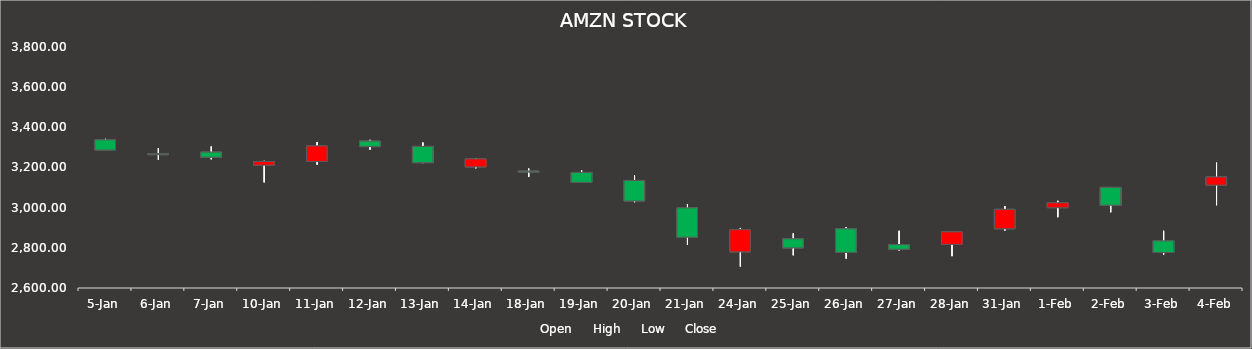
| Category | Open | High | Low | Close |
|---|---|---|---|---|
| 44566.0 | 3337.66 | 3342.53 | 3287.14 | 3287.14 |
| 44567.0 | 3269.01 | 3296 | 3238.74 | 3265.08 |
| 44568.0 | 3276.78 | 3304.87 | 3240.62 | 3251.08 |
| 44571.0 | 3211.71 | 3233.23 | 3126.09 | 3229.72 |
| 44572.0 | 3230 | 3327 | 3214.03 | 3307.24 |
| 44573.0 | 3331.5 | 3337.56 | 3288.34 | 3304.14 |
| 44574.0 | 3305.01 | 3324.43 | 3221.82 | 3224.28 |
| 44575.0 | 3203 | 3245 | 3196.01 | 3242.76 |
| 44579.0 | 3182.1 | 3194.69 | 3153.29 | 3178.35 |
| 44580.0 | 3175.24 | 3185 | 3125 | 3125.98 |
| 44581.0 | 3135.32 | 3160 | 3027.02 | 3033.35 |
| 44582.0 | 2999 | 3018 | 2814.41 | 2852.86 |
| 44585.0 | 2780 | 2898.9 | 2707.04 | 2890.88 |
| 44586.0 | 2844.85 | 2872 | 2762.9 | 2799.72 |
| 44587.0 | 2895 | 2903.7 | 2746.37 | 2777.45 |
| 44588.0 | 2816 | 2884.87 | 2787 | 2792.75 |
| 44589.0 | 2817.21 | 2879.96 | 2758.59 | 2879.56 |
| 44592.0 | 2895 | 3007.21 | 2886.01 | 2991.47 |
| 44593.0 | 3000 | 3034.16 | 2952.55 | 3023.87 |
| 44594.0 | 3101.01 | 3101.5 | 2977.27 | 3012.25 |
| 44595.0 | 2834.75 | 2884.95 | 2766.66 | 2776.91 |
| 44596.0 | 3112.13 | 3224 | 3012.16 | 3152.79 |